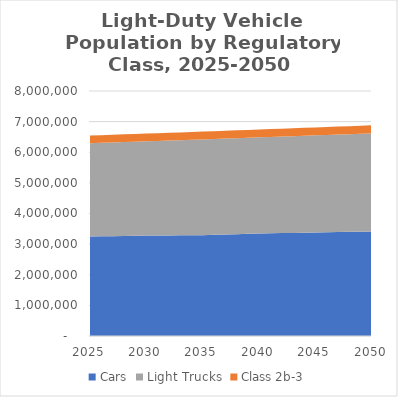
| Category | Cars | Light Trucks | Class 2b-3 |
|---|---|---|---|
| 2025.0 | 3247602.26 | 3047829.492 | 249658.589 |
| 2026.0 | 3254070 | 3053900 | 250160 |
| 2027.0 | 3260540 | 3059970 | 250650 |
| 2028.0 | 3267010 | 3066040 | 251150 |
| 2029.0 | 3273480 | 3072110 | 251650 |
| 2030.0 | 3279947.094 | 3078184.668 | 252145.09 |
| 2031.0 | 3282490 | 3087810 | 252680 |
| 2032.0 | 3285040 | 3097430 | 253220 |
| 2033.0 | 3287590 | 3107050 | 253760 |
| 2034.0 | 3290140 | 3116670 | 254300 |
| 2035.0 | 3292685.457 | 3126293.961 | 254840.474 |
| 2036.0 | 3303380 | 3129100 | 255320 |
| 2037.0 | 3314070 | 3131900 | 255800 |
| 2038.0 | 3324760 | 3134700 | 256280 |
| 2039.0 | 3335450 | 3137500 | 256750 |
| 2040.0 | 3346139.586 | 3140305.4 | 257233.621 |
| 2041.0 | 3352858.688 | 3146611.183 | 257750.15 |
| 2042.0 | 3359577.79 | 3152916.967 | 258266.679 |
| 2043.0 | 3366296.892 | 3159222.751 | 258783.209 |
| 2044.0 | 3373015.994 | 3165528.534 | 259299.738 |
| 2045.0 | 3379735.096 | 3171834.318 | 259816.267 |
| 2046.0 | 3386521.658 | 3178203.412 | 260337.982 |
| 2047.0 | 3393308.22 | 3184572.506 | 260859.697 |
| 2048.0 | 3400094.782 | 3190941.6 | 261381.413 |
| 2049.0 | 3406881.345 | 3197310.694 | 261903.128 |
| 2050.0 | 3413667.907 | 3203679.788 | 262424.843 |